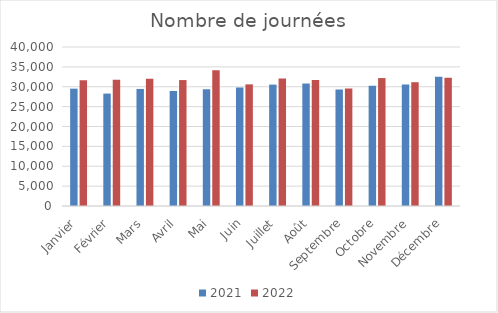
| Category | 2021 | 2022 |
|---|---|---|
| Janvier | 29517 | 31615 |
| Février | 28282 | 31792 |
| Mars | 29449 | 31997 |
| Avril | 28905 | 31682 |
| Mai | 29390 | 34131 |
| Juin | 29787 | 30598 |
| Juillet | 30540 | 32057 |
| Août | 30811 | 31708 |
| Septembre | 29313 | 29553 |
| Octobre | 30278 | 32185 |
| Novembre | 30542 | 31141 |
| Décembre | 32500 | 32263 |